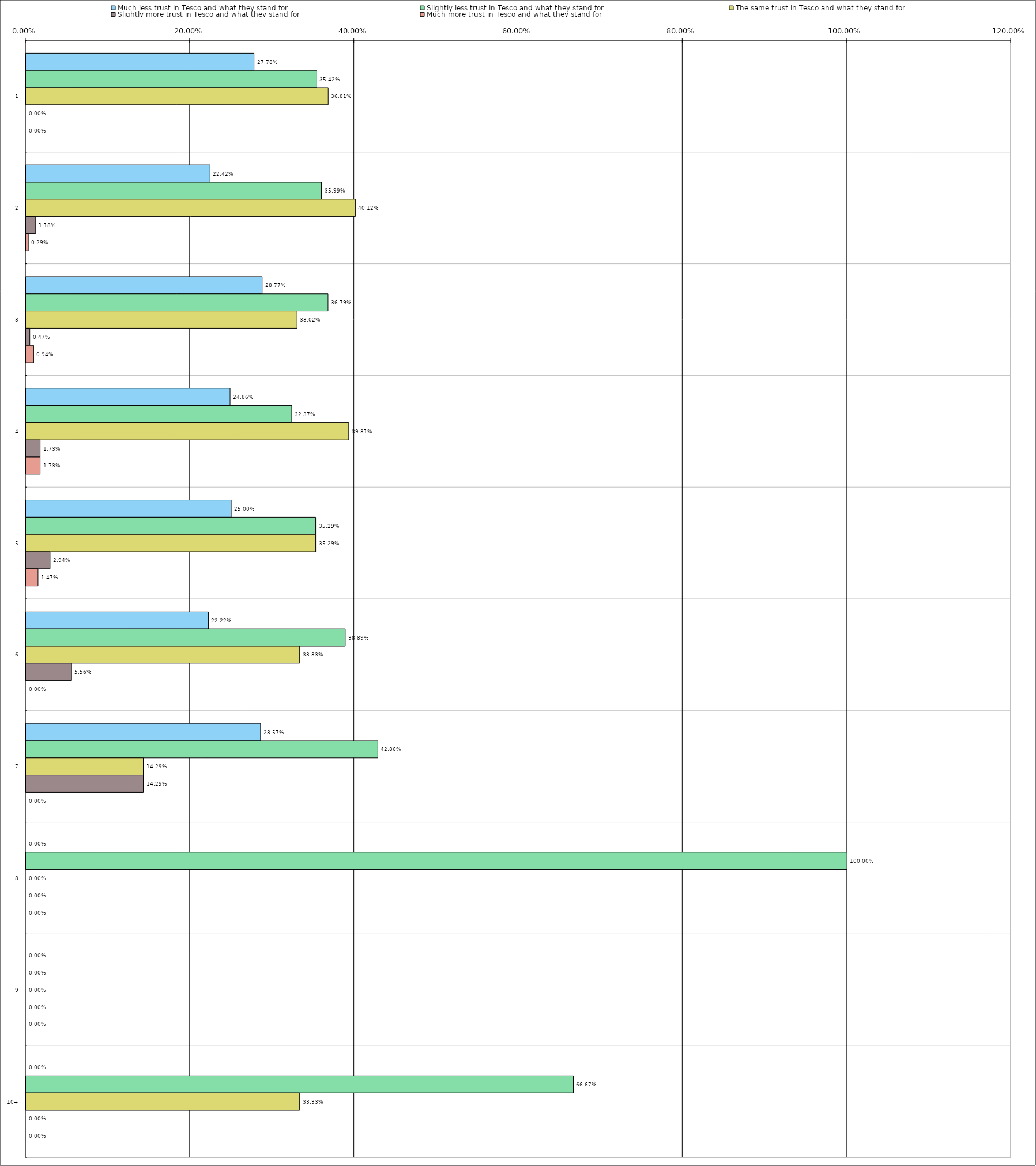
| Category | Much less trust in Tesco and what they stand for | Slightly less trust in Tesco and what they stand for | The same trust in Tesco and what they stand for | Slightly more trust in Tesco and what they stand for | Much more trust in Tesco and what they stand for |
|---|---|---|---|---|---|
| 0 | 0.278 | 0.354 | 0.368 | 0 | 0 |
| 1 | 0.224 | 0.36 | 0.401 | 0.012 | 0.003 |
| 2 | 0.288 | 0.368 | 0.33 | 0.005 | 0.009 |
| 3 | 0.249 | 0.324 | 0.393 | 0.017 | 0.017 |
| 4 | 0.25 | 0.353 | 0.353 | 0.029 | 0.015 |
| 5 | 0.222 | 0.389 | 0.333 | 0.056 | 0 |
| 6 | 0.286 | 0.429 | 0.143 | 0.143 | 0 |
| 7 | 0 | 1 | 0 | 0 | 0 |
| 8 | 0 | 0 | 0 | 0 | 0 |
| 9 | 0 | 0.667 | 0.333 | 0 | 0 |